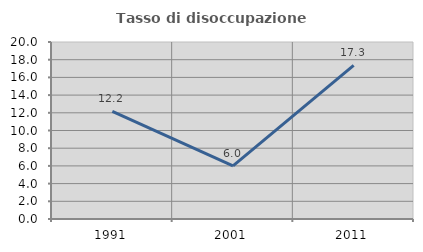
| Category | Tasso di disoccupazione giovanile  |
|---|---|
| 1991.0 | 12.155 |
| 2001.0 | 6.006 |
| 2011.0 | 17.349 |